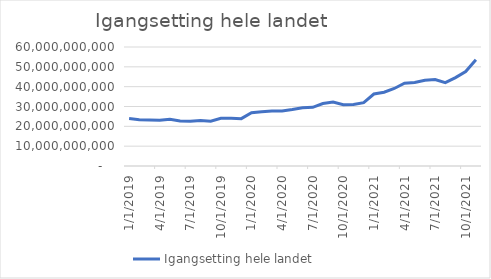
| Category | Igangsetting hele landet |
|---|---|
| 1/1/19 | 23897163250 |
| 2/1/19 | 23364946583.333 |
| 3/1/19 | 23211190333.333 |
| 4/1/19 | 23053515333.333 |
| 5/1/19 | 23589738250 |
| 6/1/19 | 22688615833.333 |
| 7/1/19 | 22559768750 |
| 8/1/19 | 22996579583.333 |
| 9/1/19 | 22595254583.333 |
| 10/1/19 | 24021193833.333 |
| 11/1/19 | 24085015500 |
| 12/1/19 | 23880375500 |
| 1/1/20 | 26878358416.667 |
| 2/1/20 | 27307054250 |
| 3/1/20 | 27725490916.667 |
| 4/1/20 | 27710519250 |
| 5/1/20 | 28453118833.333 |
| 6/1/20 | 29366312500 |
| 7/1/20 | 29586207916.667 |
| 8/1/20 | 31510834083.333 |
| 9/1/20 | 32199993666.667 |
| 10/1/20 | 30895543250 |
| 11/1/20 | 31061883250 |
| 12/1/20 | 31951158250 |
| 1/1/21 | 36301875750 |
| 2/1/21 | 37221926583.333 |
| 3/1/21 | 39077057416.667 |
| 4/1/21 | 41735634083.333 |
| 5/1/21 | 42139288250 |
| 6/1/21 | 43245879916.667 |
| 7/1/21 | 43626403666.667 |
| 8/1/21 | 42012801666.667 |
| 9/1/21 | 44577797083.333 |
| 10/1/21 | 47635168750 |
| 11/1/21 | 53561857916.667 |